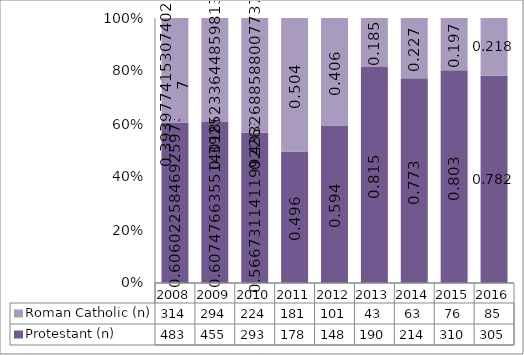
| Category | Protestant (n) | Roman Catholic (n) |
|---|---|---|
| 2008.0 | 483 | 314 |
| 2009.0 | 455 | 294 |
| 2010.0 | 293 | 224 |
| 2011.0 | 178 | 181 |
| 2012.0 | 148 | 101 |
| 2013.0 | 190 | 43 |
| 2014.0 | 214 | 63 |
| 2015.0 | 310 | 76 |
| 2016.0 | 305 | 85 |